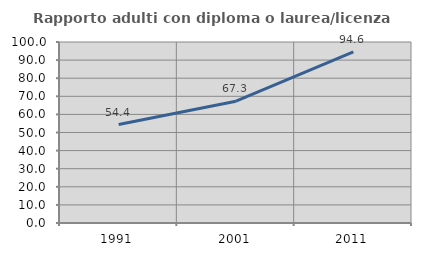
| Category | Rapporto adulti con diploma o laurea/licenza media  |
|---|---|
| 1991.0 | 54.377 |
| 2001.0 | 67.277 |
| 2011.0 | 94.605 |